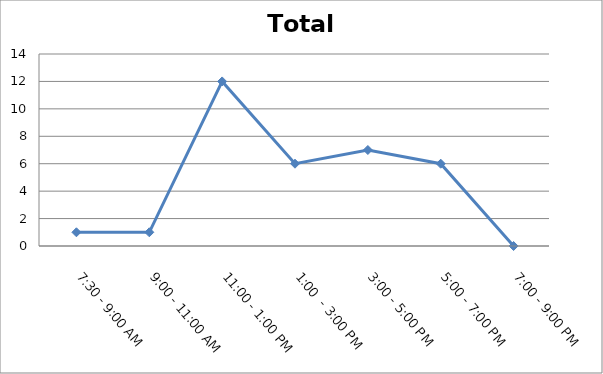
| Category | Total |
|---|---|
| 7:30 - 9:00 AM | 1 |
| 9:00 - 11:00 AM | 1 |
| 11:00 - 1:00 PM | 12 |
| 1:00  - 3:00 PM | 6 |
| 3:00 - 5:00 PM | 7 |
| 5:00 - 7:00 PM | 6 |
| 7:00 - 9:00 PM | 0 |